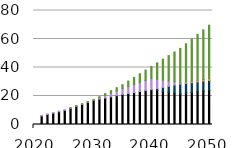
| Category | biomass | coal | natural gas | resid | waste | wind |
|---|---|---|---|---|---|---|
| 2020.0 | 0 | 0 | 0 | 0 | 0 | 0 |
| 2021.0 | 0.071 | 5.898 | 0 | 0 | 0.515 | 0 |
| 2022.0 | 0.081 | 6.868 | 0 | 0 | 0.515 | 0 |
| 2023.0 | 0.092 | 7.838 | 0 | 0 | 0.515 | 0 |
| 2024.0 | 0.103 | 8.808 | 0 | 0 | 0.515 | 0 |
| 2025.0 | 0.113 | 9.778 | 0 | 0 | 0.515 | 0 |
| 2026.0 | 0.129 | 11.175 | 0 | 0 | 0.422 | 0.093 |
| 2027.0 | 0.144 | 12.573 | 0 | 0 | 0.329 | 0.187 |
| 2028.0 | 0.16 | 13.97 | 0 | 0 | 0.235 | 0.28 |
| 2029.0 | 0.175 | 15.367 | 0 | 0 | 0.142 | 0.373 |
| 2030.0 | 0.19 | 16.765 | 0 | 0 | 0.048 | 0.467 |
| 2031.0 | 0.213 | 17.556 | -0.002 | 0 | 0.876 | 0.914 |
| 2032.0 | 0.236 | 18.348 | -0.005 | 0 | 1.704 | 1.36 |
| 2033.0 | 0.259 | 19.139 | -0.007 | 0 | 2.532 | 1.807 |
| 2034.0 | 0.281 | 19.931 | -0.009 | 0 | 3.36 | 2.254 |
| 2035.0 | 0.304 | 20.722 | -0.012 | 0 | 4.188 | 2.701 |
| 2036.0 | 0.332 | 21.38 | -0.009 | 0 | 4.91 | 3.859 |
| 2037.0 | 0.36 | 22.038 | -0.007 | 0 | 5.631 | 5.018 |
| 2038.0 | 0.388 | 22.695 | -0.005 | 0 | 6.353 | 6.176 |
| 2039.0 | 0.416 | 23.353 | -0.002 | 0 | 7.074 | 7.334 |
| 2040.0 | 0.444 | 24.011 | 0 | 0 | 7.796 | 8.492 |
| 2041.0 | 0.472 | 23.383 | 1.377 | 0 | 6.426 | 11.62 |
| 2042.0 | 0.499 | 22.755 | 2.753 | 0 | 5.055 | 14.748 |
| 2043.0 | 0.527 | 22.127 | 4.13 | 0 | 3.684 | 17.875 |
| 2044.0 | 0.555 | 21.499 | 5.506 | 0 | 2.314 | 21.003 |
| 2045.0 | 0.582 | 20.871 | 6.883 | 0 | 0.943 | 24.13 |
| 2046.0 | 0.618 | 21.353 | 6.883 | 0.213 | 0.788 | 26.811 |
| 2047.0 | 0.653 | 21.835 | 6.884 | 0.427 | 0.633 | 29.492 |
| 2048.0 | 0.689 | 22.318 | 6.885 | 0.64 | 0.478 | 32.173 |
| 2049.0 | 0.724 | 22.8 | 6.886 | 0.853 | 0.323 | 34.854 |
| 2050.0 | 0.76 | 23.282 | 6.887 | 1.066 | 0.168 | 37.535 |